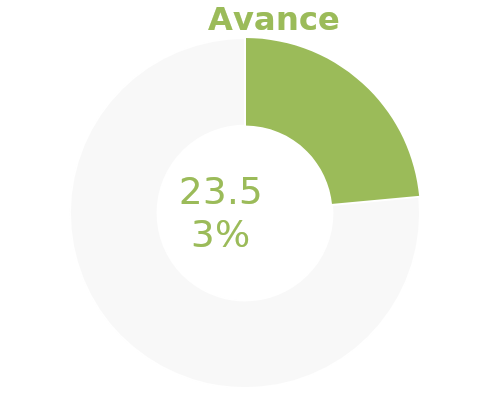
| Category | Series 0 |
|---|---|
| Acumulado 1 Trimestre | 0.235 |
| Año | -0.765 |